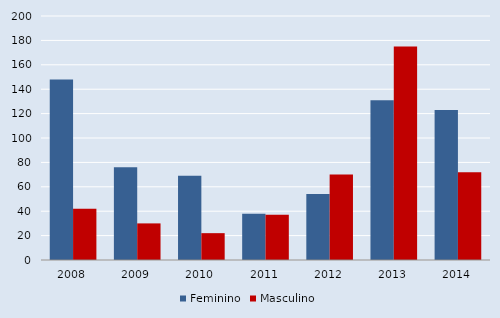
| Category | Feminino | Masculino |
|---|---|---|
| 2008.0 | 148 | 42 |
| 2009.0 | 76 | 30 |
| 2010.0 | 69 | 22 |
| 2011.0 | 38 | 37 |
| 2012.0 | 54 | 70 |
| 2013.0 | 131 | 175 |
| 2014.0 | 123 | 72 |